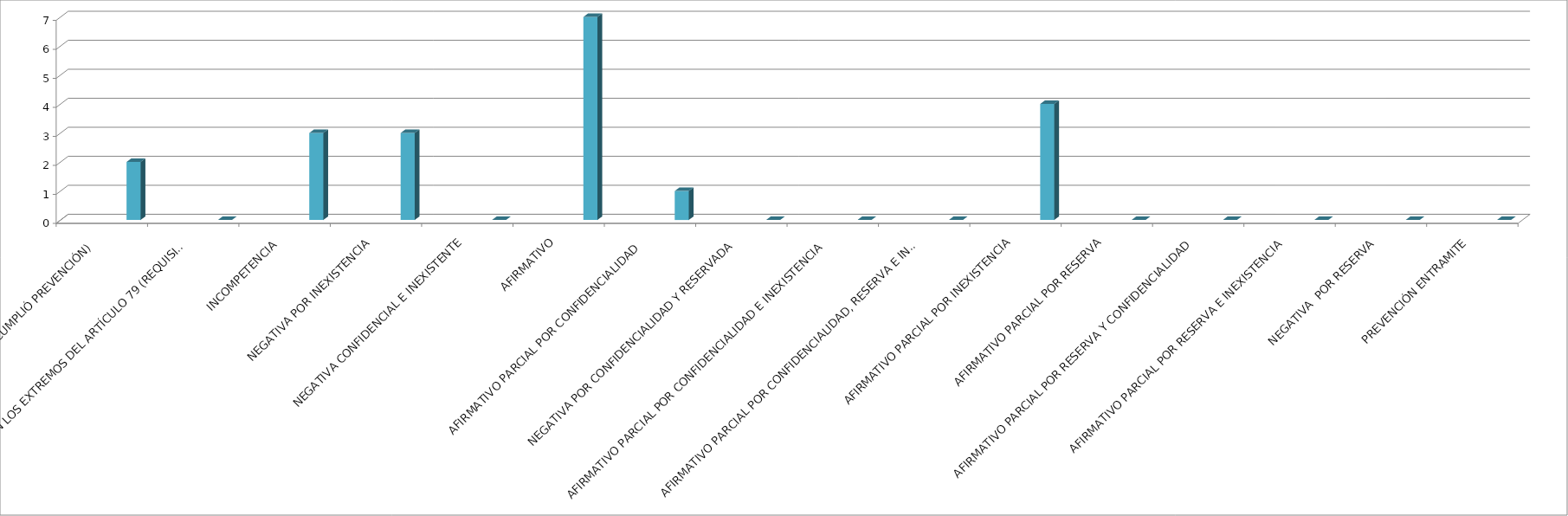
| Category | Series 0 | Series 1 | Series 2 | Series 3 | Series 4 |
|---|---|---|---|---|---|
| SE TIENE POR NO PRESENTADA ( NO CUMPLIÓ PREVENCIÓN) |  |  |  |  | 2 |
| NO CUMPLIO CON LOS EXTREMOS DEL ARTÍCULO 79 (REQUISITOS) |  |  |  |  | 0 |
| INCOMPETENCIA  |  |  |  |  | 3 |
| NEGATIVA POR INEXISTENCIA |  |  |  |  | 3 |
| NEGATIVA CONFIDENCIAL E INEXISTENTE |  |  |  |  | 0 |
| AFIRMATIVO |  |  |  |  | 7 |
| AFIRMATIVO PARCIAL POR CONFIDENCIALIDAD  |  |  |  |  | 1 |
| NEGATIVA POR CONFIDENCIALIDAD Y RESERVADA |  |  |  |  | 0 |
| AFIRMATIVO PARCIAL POR CONFIDENCIALIDAD E INEXISTENCIA |  |  |  |  | 0 |
| AFIRMATIVO PARCIAL POR CONFIDENCIALIDAD, RESERVA E INEXISTENCIA |  |  |  |  | 0 |
| AFIRMATIVO PARCIAL POR INEXISTENCIA |  |  |  |  | 4 |
| AFIRMATIVO PARCIAL POR RESERVA |  |  |  |  | 0 |
| AFIRMATIVO PARCIAL POR RESERVA Y CONFIDENCIALIDAD |  |  |  |  | 0 |
| AFIRMATIVO PARCIAL POR RESERVA E INEXISTENCIA |  |  |  |  | 0 |
| NEGATIVA  POR RESERVA |  |  |  |  | 0 |
| PREVENCIÓN ENTRAMITE |  |  |  |  | 0 |